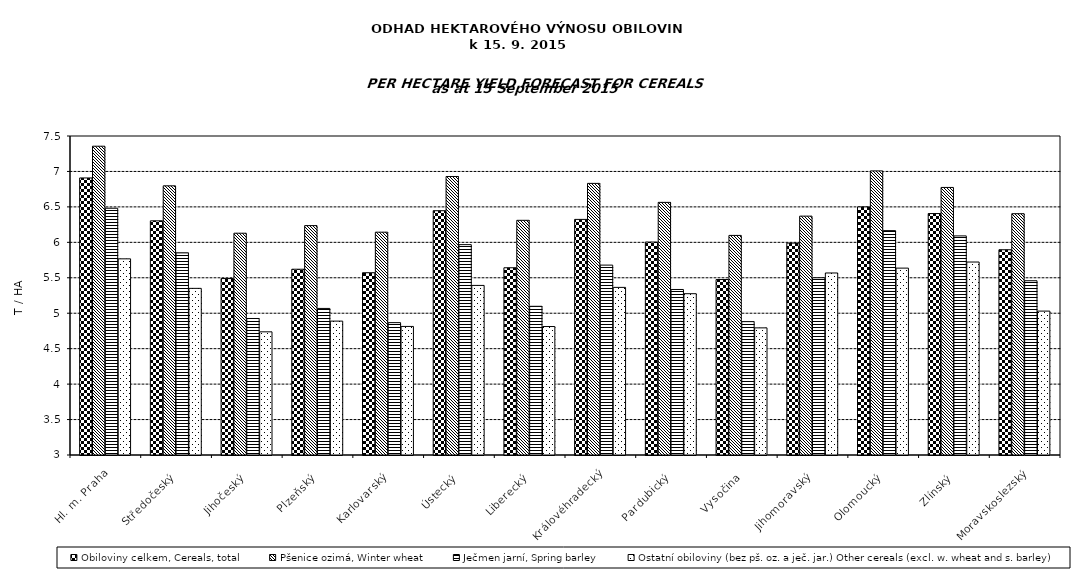
| Category | Obiloviny celkem, Cereals, total | Pšenice ozimá, Winter wheat | Ječmen jarní, Spring barley | Ostatní obiloviny (bez pš. oz. a ječ. jar.) Other cereals (excl. w. wheat and s. barley) |
|---|---|---|---|---|
|  Hl. m. Praha | 6.908 | 7.356 | 6.481 | 5.767 |
|  Středočeský | 6.303 | 6.797 | 5.851 | 5.351 |
|  Jihočeský | 5.489 | 6.129 | 4.926 | 4.737 |
|  Plzeňský | 5.621 | 6.236 | 5.068 | 4.889 |
|  Karlovarský | 5.571 | 6.143 | 4.867 | 4.814 |
|  Ústecký | 6.446 | 6.929 | 5.968 | 5.392 |
|  Liberecký | 5.641 | 6.311 | 5.097 | 4.812 |
|  Královéhradecký | 6.324 | 6.832 | 5.679 | 5.365 |
|  Pardubický | 6.004 | 6.564 | 5.335 | 5.275 |
|  Vysočina | 5.475 | 6.097 | 4.881 | 4.793 |
|  Jihomoravský | 5.989 | 6.37 | 5.5 | 5.568 |
|  Olomoucký | 6.5 | 7.007 | 6.165 | 5.636 |
|  Zlínský | 6.406 | 6.774 | 6.091 | 5.722 |
|  Moravskoslezský | 5.895 | 6.404 | 5.458 | 5.03 |